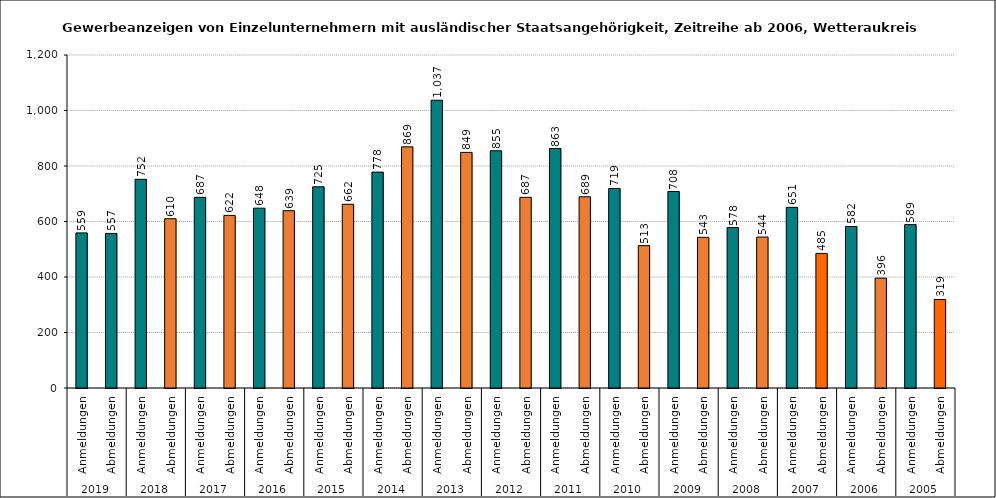
| Category | Series 0 |
|---|---|
| 0 | 559 |
| 1 | 557 |
| 2 | 752 |
| 3 | 610 |
| 4 | 687 |
| 5 | 622 |
| 6 | 648 |
| 7 | 639 |
| 8 | 725 |
| 9 | 662 |
| 10 | 778 |
| 11 | 869 |
| 12 | 1037 |
| 13 | 849 |
| 14 | 855 |
| 15 | 687 |
| 16 | 863 |
| 17 | 689 |
| 18 | 719 |
| 19 | 513 |
| 20 | 708 |
| 21 | 543 |
| 22 | 578 |
| 23 | 544 |
| 24 | 651 |
| 25 | 485 |
| 26 | 582 |
| 27 | 396 |
| 28 | 589 |
| 29 | 319 |